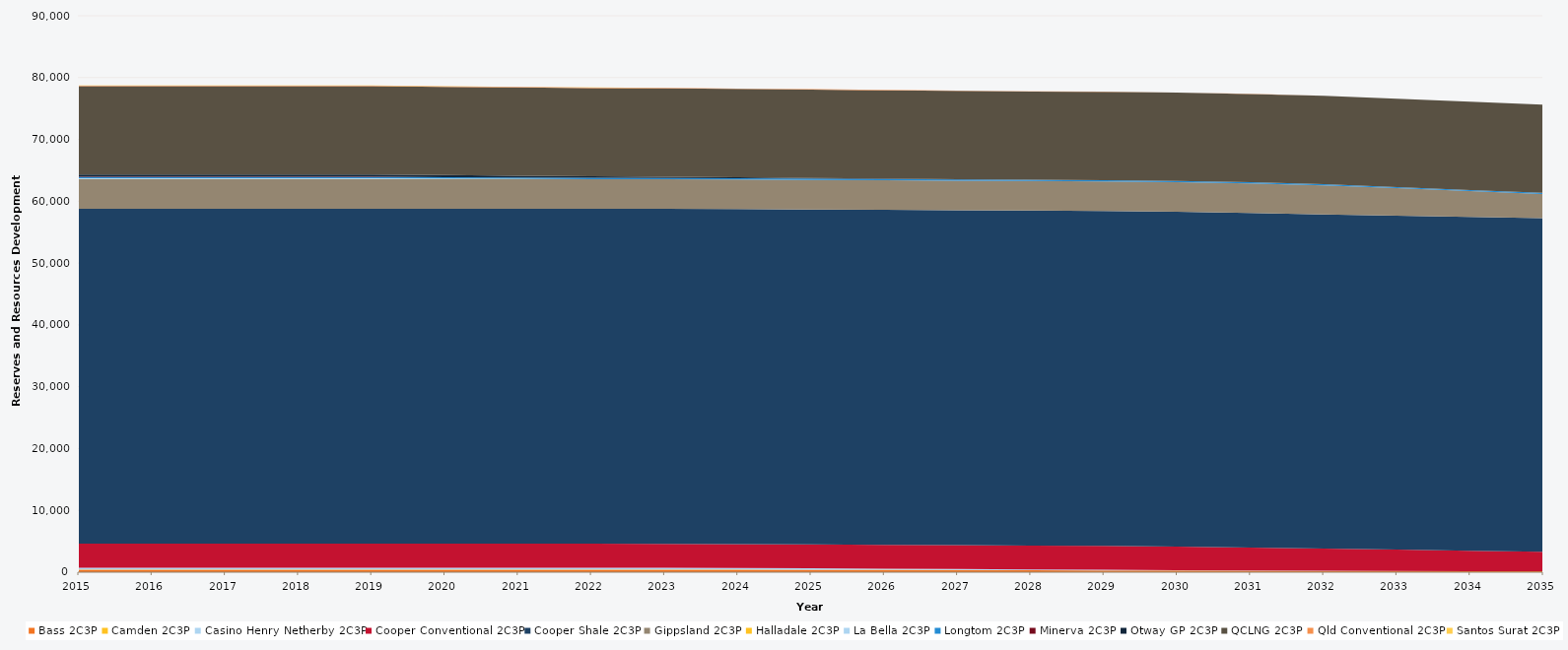
| Category | Bass 2C3P | Camden 2C3P | Casino Henry Netherby 2C3P | Cooper Conventional 2C3P | Cooper Shale 2C3P | Gippsland 2C3P | Halladale 2C3P | La Bella 2C3P | Longtom 2C3P | Minerva 2C3P | Otway GP 2C3P | QCLNG 2C3P | Qld Conventional 2C3P | Santos Surat 2C3P |
|---|---|---|---|---|---|---|---|---|---|---|---|---|---|---|
| 2015.0 | 409.522 | 36 | 273.008 | 3883.683 | 54170.916 | 4777.394 | 44 | 126.4 | 208.266 | 66.247 | 328.425 | 14279 | 88.984 | 30.64 |
| 2016.0 | 409.522 | 36 | 273.008 | 3883.683 | 54170.916 | 4777.394 | 44 | 126.4 | 208.266 | 66.247 | 328.425 | 14279 | 88.984 | 30.64 |
| 2017.0 | 409.522 | 36 | 273.008 | 3883.683 | 54170.916 | 4777.394 | 44 | 126.4 | 208.266 | 66.247 | 328.425 | 14279 | 88.984 | 30.64 |
| 2018.0 | 409.522 | 36 | 273.008 | 3883.683 | 54170.916 | 4777.394 | 44 | 126.4 | 208.266 | 66.247 | 328.425 | 14279 | 88.984 | 30.64 |
| 2019.0 | 409.522 | 36 | 273.008 | 3883.683 | 54170.916 | 4777.394 | 44 | 126.4 | 208.266 | 66.247 | 328.425 | 14279 | 88.984 | 30.64 |
| 2020.0 | 409.522 | 36 | 273.008 | 3883.683 | 54170.916 | 4777.394 | 44 | 90.868 | 208.266 | 0 | 328.425 | 14279 | 88.984 | 28.74 |
| 2021.0 | 409.522 | 36 | 273.008 | 3883.683 | 54170.916 | 4777.394 | 37.645 | 31.72 | 208.266 | 0 | 295.951 | 14279 | 88.984 | 17.76 |
| 2022.0 | 409.522 | 36 | 273.008 | 3883.683 | 54170.916 | 4777.394 | 18.785 | 3.188 | 208.266 | 0 | 239.986 | 14279 | 85.634 | 6.81 |
| 2023.0 | 409.522 | 36 | 264.908 | 3882.775 | 54170.916 | 4777.394 | 11.484 | 0.677 | 207.97 | 0 | 202.707 | 14279 | 77.604 | 0 |
| 2024.0 | 409.522 | 31.695 | 235.708 | 3882.209 | 54170.333 | 4777.394 | 11.484 | 0 | 207.799 | 0 | 156.224 | 14279 | 69.574 | 0 |
| 2025.0 | 385.947 | 26.205 | 206.428 | 3880.995 | 54169.75 | 4777.394 | 3.318 | 0 | 207.799 | 0 | 117.037 | 14279 | 61.522 | 0 |
| 2026.0 | 361.492 | 20.73 | 177.228 | 3880.751 | 54169.165 | 4777.394 | 0.636 | 0 | 207.799 | 0 | 73.359 | 14279 | 53.492 | 0 |
| 2027.0 | 337.037 | 15.255 | 148.028 | 3879.743 | 54168.302 | 4777.394 | 0 | 0 | 207.799 | 0 | 27.764 | 14279 | 45.462 | 0 |
| 2028.0 | 312.582 | 9.78 | 118.828 | 3878.963 | 54167.153 | 4777.394 | 0 | 0 | 207.799 | 0 | 0 | 14279 | 37.432 | 0 |
| 2029.0 | 288.06 | 4.29 | 89.548 | 3878.764 | 54166.763 | 4777.394 | 0 | 0 | 206.306 | 0 | 0 | 14279 | 29.38 | 0 |
| 2030.0 | 263.605 | 2.709 | 60.348 | 3830.117 | 54150.637 | 4777.394 | 0 | 0 | 206.306 | 0 | 0 | 14279 | 21.35 | 0 |
| 2031.0 | 239.15 | 1.295 | 31.148 | 3711.681 | 54107.628 | 4777.394 | 0 | 0 | 206.306 | 0 | 0 | 14279 | 13.32 | 0 |
| 2032.0 | 214.695 | 0.191 | 17.638 | 3581.253 | 54061.151 | 4693.734 | 0 | 0 | 205.157 | 0 | 0 | 14279 | 11.506 | 0 |
| 2033.0 | 190.173 | 0 | 12.44 | 3448.12 | 54015.738 | 4443.092 | 0 | 0 | 191.089 | 0 | 0 | 14279 | 7.066 | 0 |
| 2034.0 | 165.718 | 0 | 6.205 | 3310.787 | 53974.827 | 4188.784 | 0 | 0 | 178.792 | 0 | 0 | 14279 | 2.024 | 0 |
| 2035.0 | 141.263 | 0 | 0 | 3177.86 | 53929.361 | 3930.507 | 0 | 0 | 164.219 | 0 | 0 | 14279 | 0 | 0 |